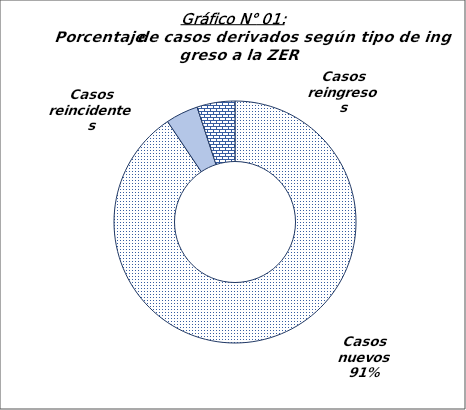
| Category | Series 0 |
|---|---|
| Casos nuevos | 732 |
| Casos reincidentes | 35 |
| Casos reingresos | 41 |